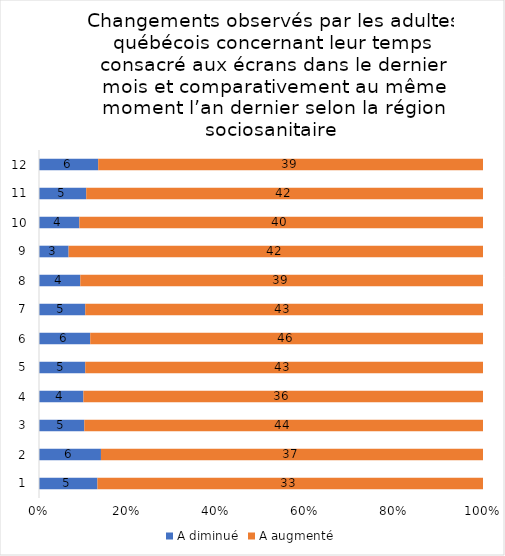
| Category | A diminué | A augmenté |
|---|---|---|
| 0 | 5 | 33 |
| 1 | 6 | 37 |
| 2 | 5 | 44 |
| 3 | 4 | 36 |
| 4 | 5 | 43 |
| 5 | 6 | 46 |
| 6 | 5 | 43 |
| 7 | 4 | 39 |
| 8 | 3 | 42 |
| 9 | 4 | 40 |
| 10 | 5 | 42 |
| 11 | 6 | 39 |